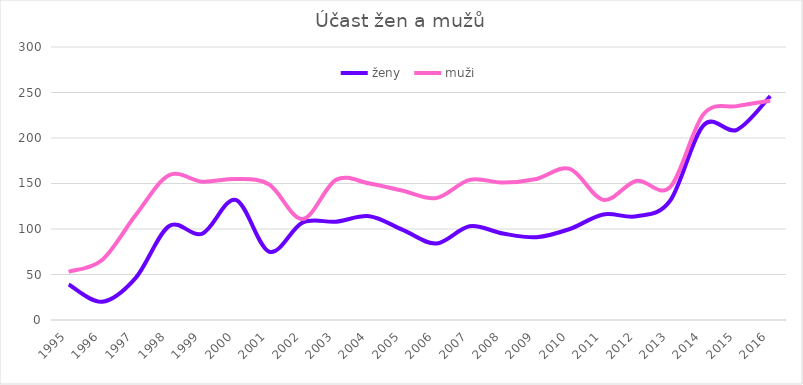
| Category | ženy | muži |
|---|---|---|
| 1995.0 | 39 | 53 |
| 1996.0 | 20 | 66 |
| 1997.0 | 46 | 115 |
| 1998.0 | 103 | 159 |
| 1999.0 | 95 | 152 |
| 2000.0 | 132 | 155 |
| 2001.0 | 75 | 149 |
| 2002.0 | 107 | 111 |
| 2003.0 | 108 | 154 |
| 2004.0 | 114 | 150 |
| 2005.0 | 99 | 142 |
| 2006.0 | 84 | 134 |
| 2007.0 | 103 | 154 |
| 2008.0 | 95 | 151 |
| 2009.0 | 91 | 155 |
| 2010.0 | 100 | 166 |
| 2011.0 | 116 | 132 |
| 2012.0 | 114 | 153 |
| 2013.0 | 131 | 146 |
| 2014.0 | 214 | 226 |
| 2015.0 | 209 | 235 |
| 2016.0 | 246 | 241 |